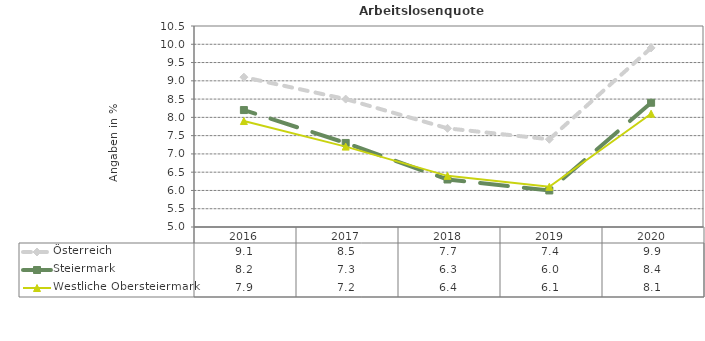
| Category | Österreich | Steiermark | Westliche Obersteiermark |
|---|---|---|---|
| 2020.0 | 9.9 | 8.4 | 8.1 |
| 2019.0 | 7.4 | 6 | 6.1 |
| 2018.0 | 7.7 | 6.3 | 6.4 |
| 2017.0 | 8.5 | 7.3 | 7.2 |
| 2016.0 | 9.1 | 8.2 | 7.9 |